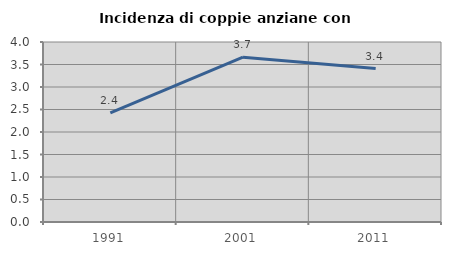
| Category | Incidenza di coppie anziane con figli |
|---|---|
| 1991.0 | 2.424 |
| 2001.0 | 3.663 |
| 2011.0 | 3.411 |